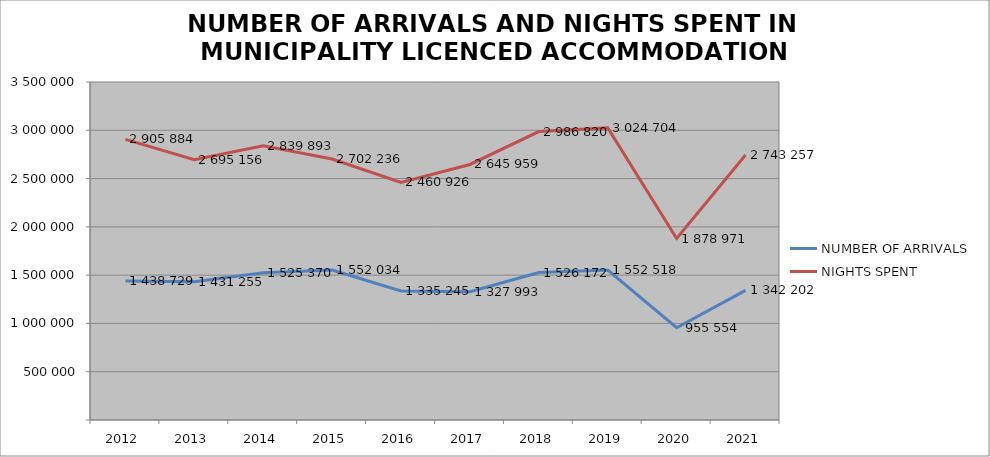
| Category | NUMBER OF ARRIVALS | NIGHTS SPENT |
|---|---|---|
| 2012 | 1438729 | 2905884 |
| 2013 | 1431255 | 2695156 |
| 2014 | 1525370 | 2839893 |
| 2015 | 1552034 | 2702236 |
| 2016 | 1335245 | 2460926 |
| 2017 | 1327993 | 2645959 |
| 2018 | 1526172 | 2986820 |
| 2019 | 1552518 | 3024704 |
| 2020 | 955554 | 1878971 |
| 2021 | 1342202 | 2743257 |